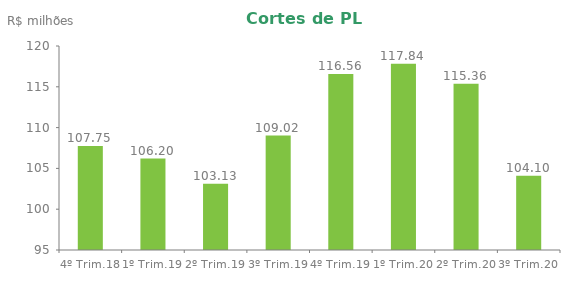
| Category | Series 0 |
|---|---|
| 4º Trim.18 | 107.752 |
| 1º Trim.19 | 106.202 |
| 2º Trim.19 | 103.131 |
| 3º Trim.19 | 109.023 |
| 4º Trim.19 | 116.56 |
| 1º Trim.20 | 117.839 |
| 2º Trim.20 | 115.362 |
| 3º Trim.20 | 104.099 |